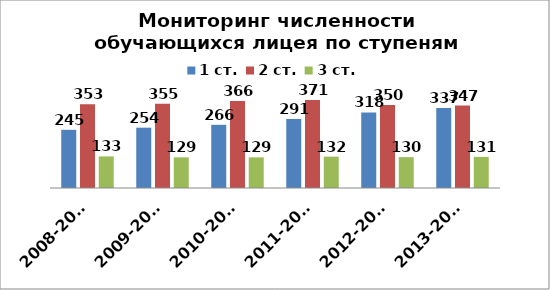
| Category | 1 ст. | 2 ст. | 3 ст. |
|---|---|---|---|
| 2008-2008 | 245 | 353 | 133 |
| 2009-2010 | 254 | 355 | 129 |
| 2010-2011 | 266 | 366 | 129 |
| 2011-2012 | 291 | 371 | 132 |
| 2012-2013 | 318 | 350 | 130 |
| 2013-2014 | 337 | 347 | 131 |